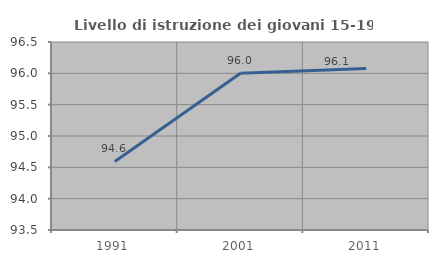
| Category | Livello di istruzione dei giovani 15-19 anni |
|---|---|
| 1991.0 | 94.595 |
| 2001.0 | 96 |
| 2011.0 | 96.078 |